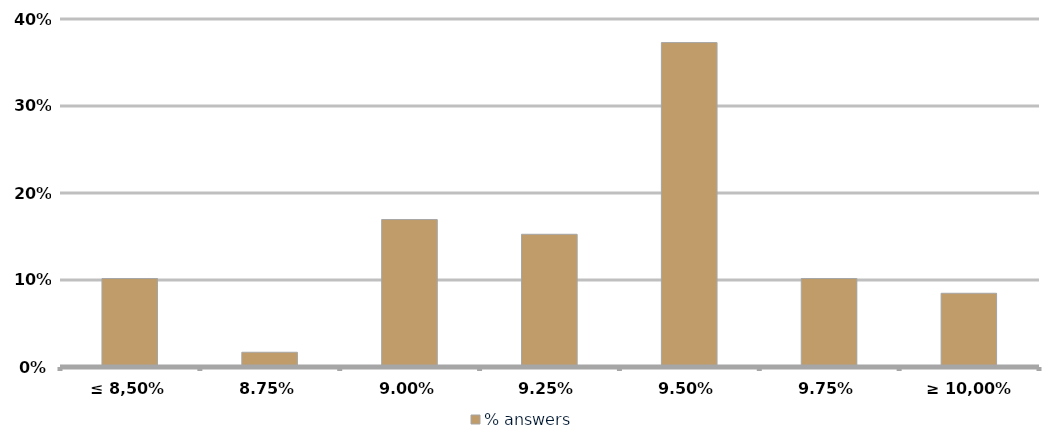
| Category | % answers |
|---|---|
| ≤ 8,50% | 0.102 |
| 8.75% | 0.017 |
| 9.00% | 0.169 |
| 9.25% | 0.153 |
| 9.50% | 0.373 |
| 9.75% | 0.102 |
| ≥ 10,00% | 0.085 |